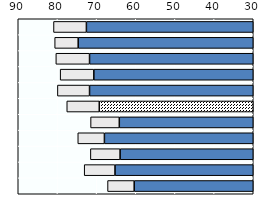
| Category | Series 1 | Series 0 |
|---|---|---|
| 0 | 72.6 | 8.4 |
| 1 | 74.7 | 6 |
| 2 | 71.8 | 8.6 |
| 3 | 70.7 | 8.6 |
| 4 | 71.8 | 8.2 |
| 5 | 69.314 | 8.297 |
| 6 | 64.2 | 7.332 |
| 7 | 68 | 6.8 |
| 8 | 64 | 7.581 |
| 9 | 65.3 | 7.861 |
| 10 | 60.4 | 6.8 |